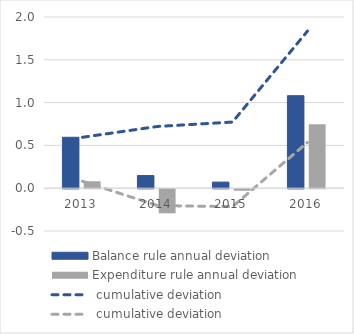
| Category | Balance rule | Expenditure rule |
|---|---|---|
| 2013.0 | 0.595 | 0.081 |
| 2014.0 | 0.148 | -0.281 |
| 2015.0 | 0.071 | -0.018 |
| 2016.0 | 1.081 | 0.746 |